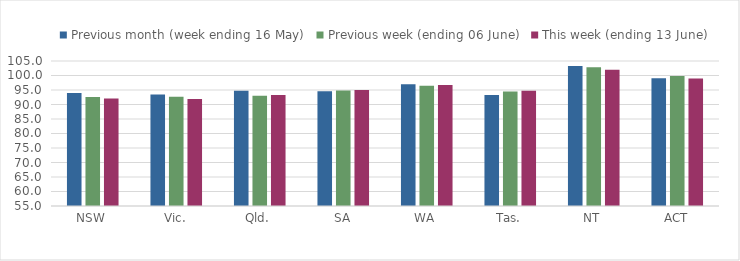
| Category | Previous month (week ending 16 May) | Previous week (ending 06 June) | This week (ending 13 June) |
|---|---|---|---|
| NSW | 93.959 | 92.627 | 92.069 |
| Vic. | 93.489 | 92.706 | 91.918 |
| Qld. | 94.757 | 93.053 | 93.238 |
| SA | 94.58 | 94.857 | 95.03 |
| WA | 96.969 | 96.479 | 96.743 |
| Tas. | 93.303 | 94.523 | 94.764 |
| NT | 103.281 | 102.855 | 101.957 |
| ACT | 99.092 | 99.849 | 98.951 |